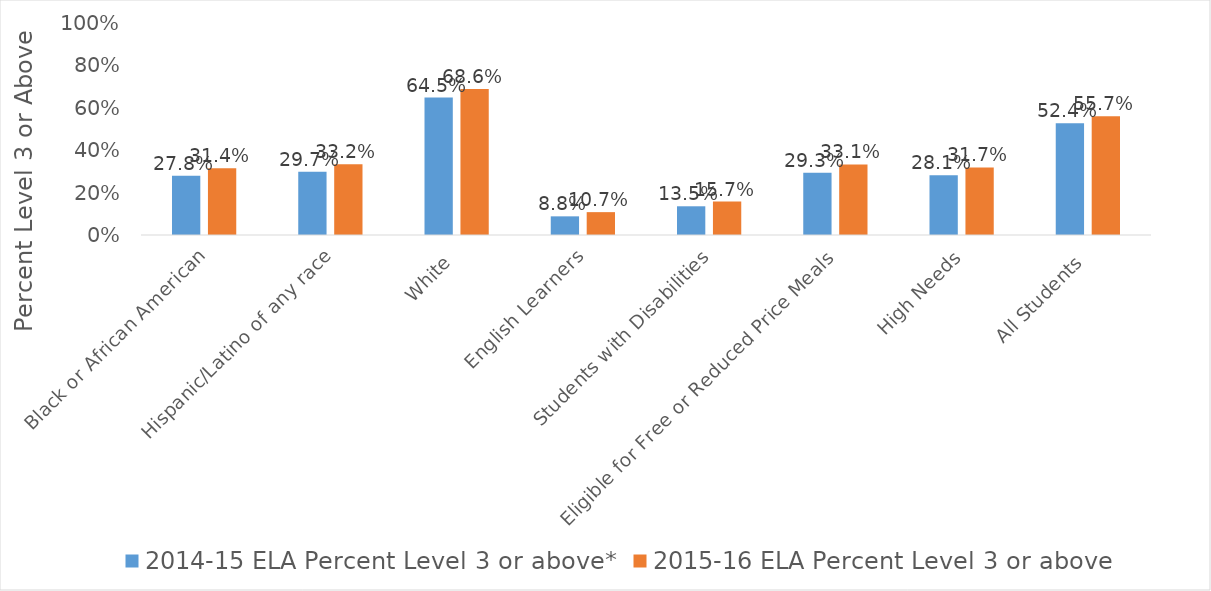
| Category | 2014-15 ELA Percent Level 3 or above* | 2015-16 ELA Percent Level 3 or above |
|---|---|---|
| Black or African American | 0.278 | 0.314 |
| Hispanic/Latino of any race | 0.297 | 0.332 |
| White | 0.645 | 0.686 |
| English Learners | 0.088 | 0.107 |
| Students with Disabilities | 0.135 | 0.157 |
| Eligible for Free or Reduced Price Meals | 0.293 | 0.331 |
| High Needs | 0.281 | 0.317 |
| All Students | 0.524 | 0.557 |